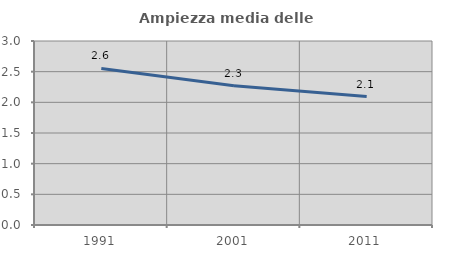
| Category | Ampiezza media delle famiglie |
|---|---|
| 1991.0 | 2.552 |
| 2001.0 | 2.27 |
| 2011.0 | 2.094 |